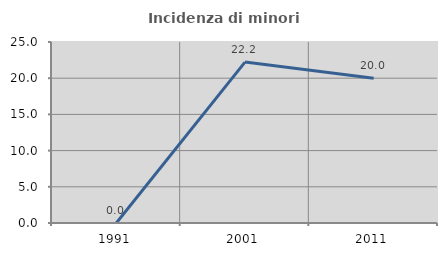
| Category | Incidenza di minori stranieri |
|---|---|
| 1991.0 | 0 |
| 2001.0 | 22.222 |
| 2011.0 | 20 |